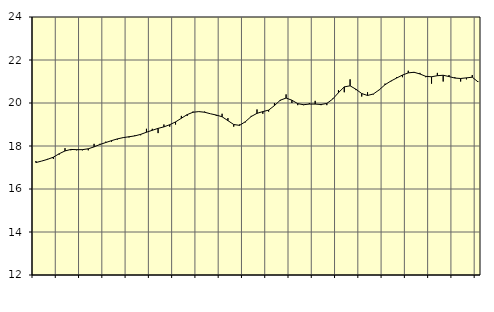
| Category | Piggar | Vård och omsorg, SNI 86-88 |
|---|---|---|
| nan | 17.3 | 17.23 |
| 1.0 | 17.3 | 17.3 |
| 1.0 | 17.4 | 17.38 |
| 1.0 | 17.4 | 17.48 |
| nan | 17.6 | 17.64 |
| 2.0 | 17.9 | 17.77 |
| 2.0 | 17.8 | 17.84 |
| 2.0 | 17.8 | 17.83 |
| nan | 17.8 | 17.83 |
| 3.0 | 17.8 | 17.87 |
| 3.0 | 18.1 | 17.96 |
| 3.0 | 18.1 | 18.07 |
| nan | 18.2 | 18.16 |
| 4.0 | 18.2 | 18.25 |
| 4.0 | 18.3 | 18.33 |
| 4.0 | 18.4 | 18.39 |
| nan | 18.4 | 18.43 |
| 5.0 | 18.5 | 18.47 |
| 5.0 | 18.5 | 18.54 |
| 5.0 | 18.8 | 18.64 |
| nan | 18.8 | 18.73 |
| 6.0 | 18.6 | 18.82 |
| 6.0 | 19 | 18.89 |
| 6.0 | 18.9 | 18.99 |
| nan | 19 | 19.12 |
| 7.0 | 19.4 | 19.29 |
| 7.0 | 19.4 | 19.46 |
| 7.0 | 19.6 | 19.57 |
| nan | 19.6 | 19.6 |
| 8.0 | 19.6 | 19.57 |
| 8.0 | 19.5 | 19.5 |
| 8.0 | 19.4 | 19.44 |
| nan | 19.5 | 19.36 |
| 9.0 | 19.3 | 19.18 |
| 9.0 | 18.9 | 19 |
| 9.0 | 19 | 18.96 |
| nan | 19.1 | 19.13 |
| 10.0 | 19.4 | 19.37 |
| 10.0 | 19.7 | 19.52 |
| 10.0 | 19.5 | 19.6 |
| nan | 19.6 | 19.67 |
| 11.0 | 20 | 19.88 |
| 11.0 | 20.1 | 20.13 |
| 11.0 | 20.4 | 20.23 |
| nan | 20 | 20.13 |
| 12.0 | 19.9 | 19.97 |
| 12.0 | 19.9 | 19.92 |
| 12.0 | 20 | 19.95 |
| nan | 20.1 | 19.95 |
| 13.0 | 19.9 | 19.93 |
| 13.0 | 19.9 | 19.98 |
| 13.0 | 20.2 | 20.18 |
| nan | 20.6 | 20.48 |
| 14.0 | 20.5 | 20.75 |
| 14.0 | 21.1 | 20.8 |
| 14.0 | 20.6 | 20.64 |
| nan | 20.3 | 20.44 |
| 15.0 | 20.5 | 20.35 |
| 15.0 | 20.4 | 20.42 |
| 15.0 | 20.6 | 20.61 |
| nan | 20.9 | 20.85 |
| 16.0 | 21 | 21.02 |
| 16.0 | 21.2 | 21.16 |
| 16.0 | 21.2 | 21.3 |
| nan | 21.5 | 21.4 |
| 17.0 | 21.4 | 21.43 |
| 17.0 | 21.4 | 21.35 |
| 17.0 | 21.2 | 21.24 |
| nan | 20.9 | 21.22 |
| 18.0 | 21.4 | 21.27 |
| 18.0 | 21 | 21.29 |
| 18.0 | 21.3 | 21.23 |
| nan | 21.2 | 21.16 |
| 19.0 | 21 | 21.14 |
| 19.0 | 21.1 | 21.17 |
| 19.0 | 21.3 | 21.2 |
| nan | 21 | 20.98 |